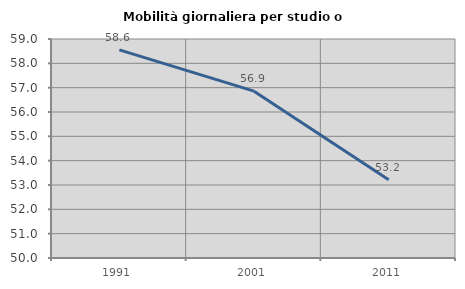
| Category | Mobilità giornaliera per studio o lavoro |
|---|---|
| 1991.0 | 58.555 |
| 2001.0 | 56.856 |
| 2011.0 | 53.216 |